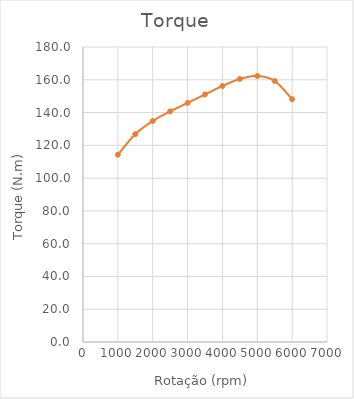
| Category | Torque |
|---|---|
| 1000.0 | 114.262 |
| 1500.0 | 126.81 |
| 2000.0 | 134.861 |
| 2500.0 | 140.708 |
| 3000.0 | 145.86 |
| 3500.0 | 151.044 |
| 4000.0 | 156.205 |
| 4500.0 | 160.507 |
| 5000.0 | 162.329 |
| 5500.0 | 159.272 |
| 6000.0 | 148.152 |